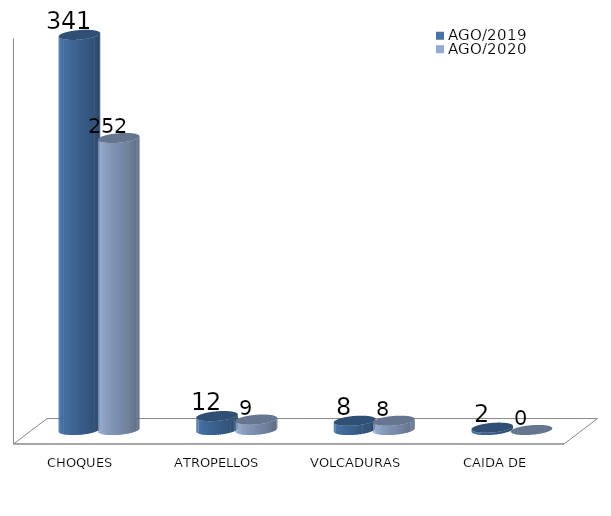
| Category | AGO/2019 | AGO/2020 |
|---|---|---|
| CHOQUES | 341 | 252 |
| ATROPELLOS | 12 | 9 |
| VOLCADURAS | 8 | 8 |
| CAIDA DE PERSONAS | 2 | 0 |